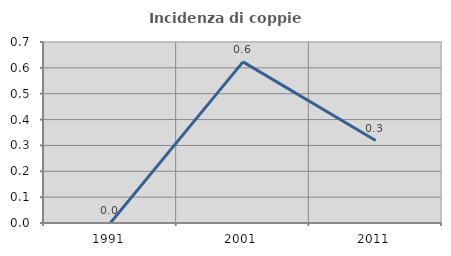
| Category | Incidenza di coppie miste |
|---|---|
| 1991.0 | 0 |
| 2001.0 | 0.623 |
| 2011.0 | 0.319 |